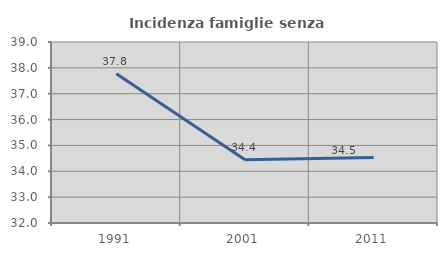
| Category | Incidenza famiglie senza nuclei |
|---|---|
| 1991.0 | 37.775 |
| 2001.0 | 34.448 |
| 2011.0 | 34.533 |